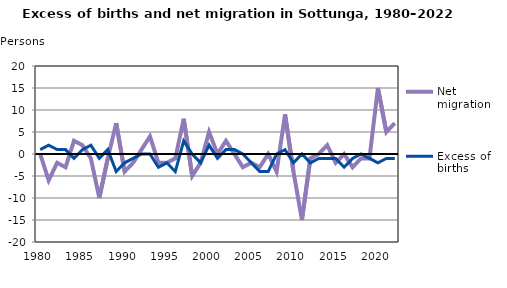
| Category | Net migration | Excess of births |
|---|---|---|
| 1980.0 | 0 | 1 |
| 1981.0 | -6 | 2 |
| 1982.0 | -2 | 1 |
| 1983.0 | -3 | 1 |
| 1984.0 | 3 | -1 |
| 1985.0 | 2 | 1 |
| 1986.0 | -1 | 2 |
| 1987.0 | -10 | -1 |
| 1988.0 | -1 | 1 |
| 1989.0 | 7 | -4 |
| 1990.0 | -4 | -2 |
| 1991.0 | -2 | -1 |
| 1992.0 | 1 | 0 |
| 1993.0 | 4 | 0 |
| 1994.0 | -2 | -3 |
| 1995.0 | -2 | -2 |
| 1996.0 | -1 | -4 |
| 1997.0 | 8 | 3 |
| 1998.0 | -5 | 0 |
| 1999.0 | -2 | -2 |
| 2000.0 | 5 | 2 |
| 2001.0 | 0 | -1 |
| 2002.0 | 3 | 1 |
| 2003.0 | 0 | 1 |
| 2004.0 | -3 | 0 |
| 2005.0 | -2 | -2 |
| 2006.0 | -3 | -4 |
| 2007.0 | 0 | -4 |
| 2008.0 | -4 | 0 |
| 2009.0 | 9 | 1 |
| 2010.0 | -4 | -2 |
| 2011.0 | -15 | 0 |
| 2012.0 | -1 | -2 |
| 2013.0 | 0 | -1 |
| 2014.0 | 2 | -1 |
| 2015.0 | -2 | -1 |
| 2016.0 | 0 | -3 |
| 2017.0 | -3 | -1 |
| 2018.0 | -1 | 0 |
| 2019.0 | -1 | -1 |
| 2020.0 | 15 | -2 |
| 2021.0 | 5 | -1 |
| 2022.0 | 7 | -1 |